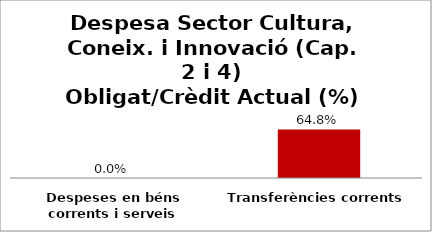
| Category | Series 0 |
|---|---|
| Despeses en béns corrents i serveis | 0 |
| Transferències corrents | 0.648 |